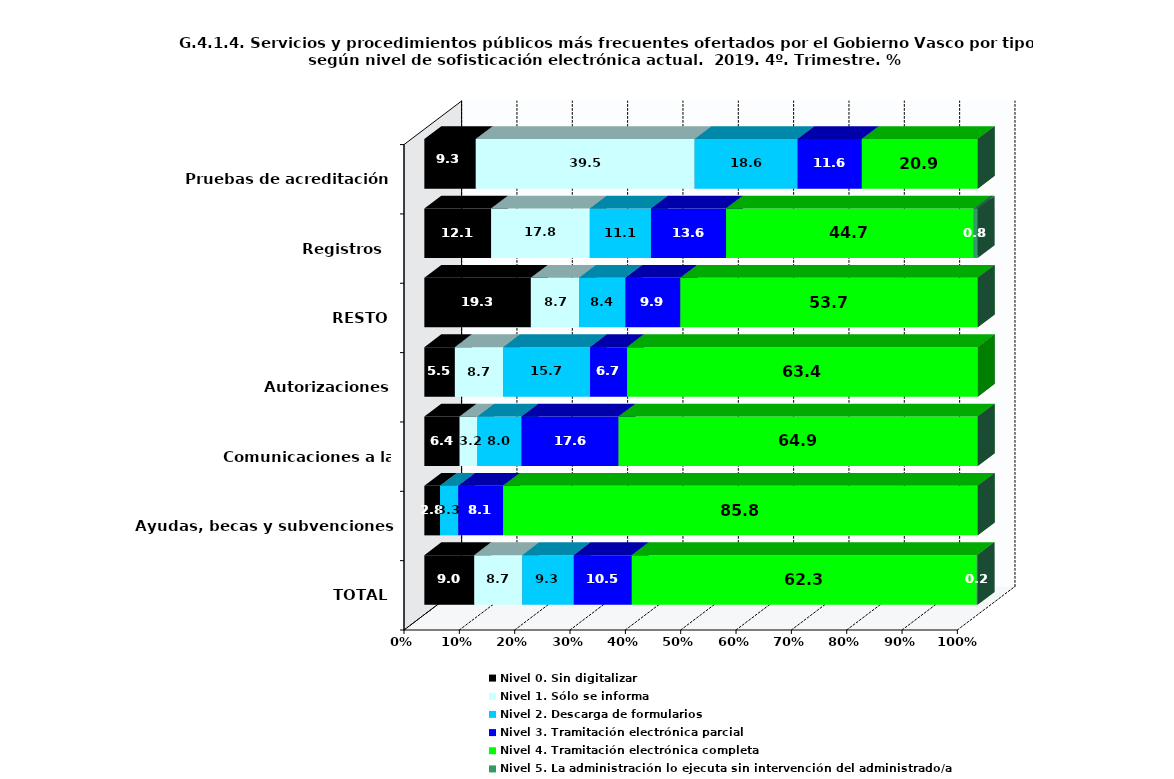
| Category | Nivel 0. Sin digitalizar | Nivel 1. Sólo se informa | Nivel 2. Descarga de formularios | Nivel 3. Tramitación electrónica parcial | Nivel 4. Tramitación electrónica completa | Nivel 5. La administración lo ejecuta sin intervención del administrado/a |
|---|---|---|---|---|---|---|
| TOTAL | 9.018 | 8.676 | 9.304 | 10.502 | 62.329 | 0.171 |
| Ayudas, becas y subvenciones | 2.845 | 0 | 3.282 | 8.096 | 85.777 | 0 |
| Comunicaciones a la Administración | 6.383 | 3.191 | 7.979 | 17.553 | 64.894 | 0 |
| Autorizaciones | 5.523 | 8.721 | 15.698 | 6.686 | 63.372 | 0 |
| RESTO | 19.255 | 8.696 | 8.385 | 9.938 | 53.727 | 0 |
| Registros  | 12.06 | 17.839 | 11.055 | 13.568 | 44.724 | 0.754 |
| Pruebas de acreditación | 9.302 | 39.535 | 18.605 | 11.628 | 20.93 | 0 |